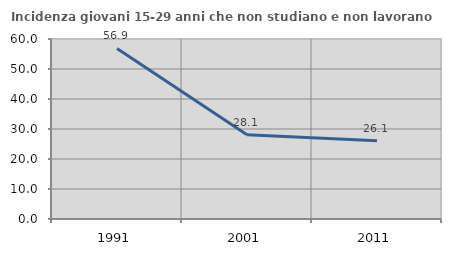
| Category | Incidenza giovani 15-29 anni che non studiano e non lavorano  |
|---|---|
| 1991.0 | 56.873 |
| 2001.0 | 28.07 |
| 2011.0 | 26.106 |